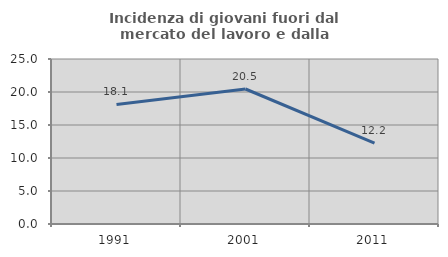
| Category | Incidenza di giovani fuori dal mercato del lavoro e dalla formazione  |
|---|---|
| 1991.0 | 18.121 |
| 2001.0 | 20.455 |
| 2011.0 | 12.245 |